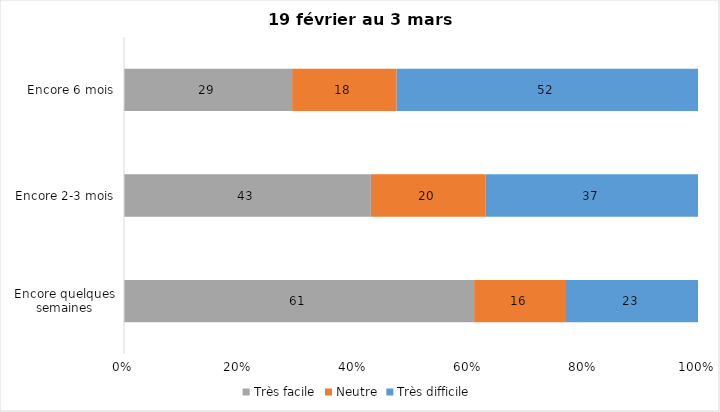
| Category | Très facile | Neutre | Très difficile |
|---|---|---|---|
| Encore quelques semaines | 61 | 16 | 23 |
| Encore 2-3 mois | 43 | 20 | 37 |
| Encore 6 mois | 29 | 18 | 52 |